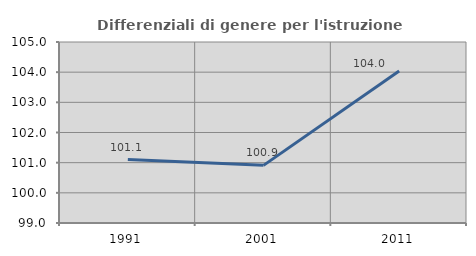
| Category | Differenziali di genere per l'istruzione superiore |
|---|---|
| 1991.0 | 101.102 |
| 2001.0 | 100.911 |
| 2011.0 | 104.042 |